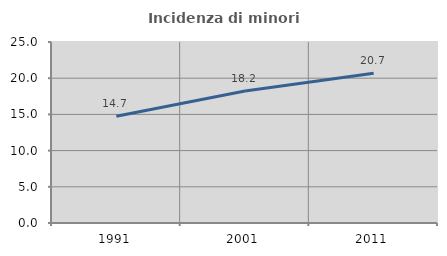
| Category | Incidenza di minori stranieri |
|---|---|
| 1991.0 | 14.737 |
| 2001.0 | 18.22 |
| 2011.0 | 20.673 |